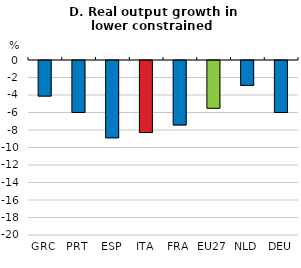
| Category | Real output growth in lower constrained sectors |
|---|---|
| GRC | -4.066 |
| PRT | -5.941 |
| ESP | -8.833 |
| ITA | -8.234 |
| FRA | -7.367 |
| EU27 | -5.461 |
| NLD | -2.85 |
| DEU | -5.946 |